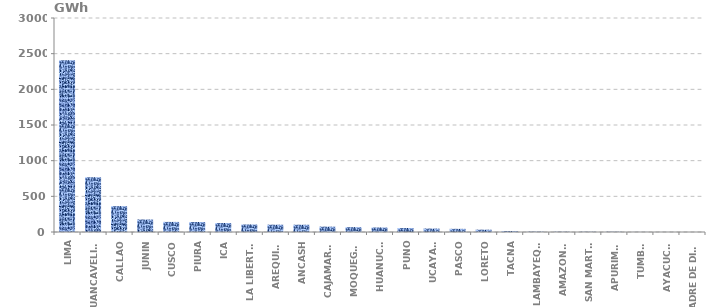
| Category | Series 0 |
|---|---|
| LIMA | 2406.899 |
| HUANCAVELICA | 768.435 |
| CALLAO | 362.485 |
| JUNIN | 175.116 |
| CUSCO | 141.47 |
| PIURA | 140.033 |
| ICA | 126.18 |
| LA LIBERTAD | 105.472 |
| AREQUIPA | 102.476 |
| ANCASH | 101.979 |
| CAJAMARCA | 75.056 |
| MOQUEGUA | 68.03 |
| HUANUCO | 63.235 |
| PUNO | 56.49 |
| UCAYALI | 48.297 |
| PASCO | 44.445 |
| LORETO | 32.74 |
| TACNA | 13.321 |
| LAMBAYEQUE | 5.212 |
| AMAZONAS | 4.106 |
| SAN MARTÍN | 3.637 |
| APURIMAC | 3.63 |
| TUMBES | 1.101 |
| AYACUCHO | 0.658 |
| MADRE DE DIOS | 0.187 |